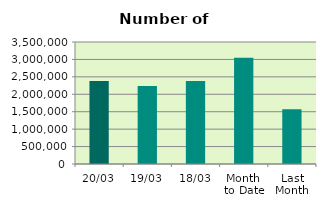
| Category | Series 0 |
|---|---|
| 20/03 | 2380548 |
| 19/03 | 2234242 |
| 18/03 | 2378764 |
| Month 
to Date | 3045753.733 |
| Last
Month | 1567888.4 |